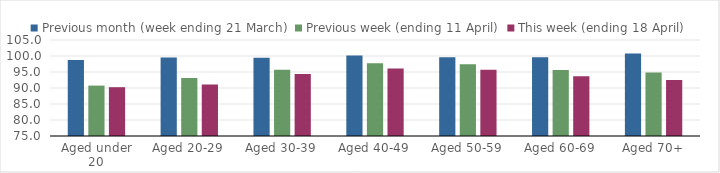
| Category | Previous month (week ending 21 March) | Previous week (ending 11 April) | This week (ending 18 April) |
|---|---|---|---|
| Aged under 20 | 98.778 | 90.75 | 90.252 |
| Aged 20-29 | 99.515 | 93.163 | 91.083 |
| Aged 30-39 | 99.482 | 95.732 | 94.349 |
| Aged 40-49 | 100.148 | 97.71 | 96.092 |
| Aged 50-59 | 99.618 | 97.411 | 95.715 |
| Aged 60-69 | 99.605 | 95.628 | 93.652 |
| Aged 70+ | 100.782 | 94.863 | 92.47 |